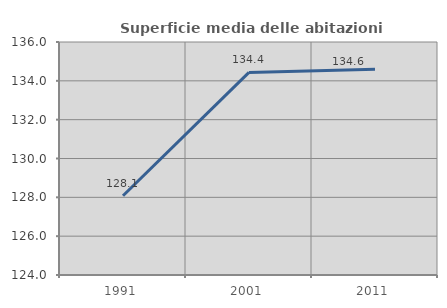
| Category | Superficie media delle abitazioni occupate |
|---|---|
| 1991.0 | 128.08 |
| 2001.0 | 134.434 |
| 2011.0 | 134.596 |